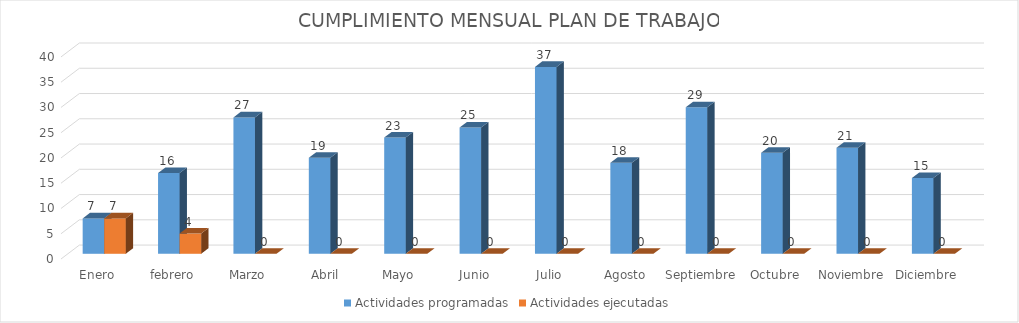
| Category | Actividades programadas | Actividades ejecutadas |
|---|---|---|
| Enero | 7 | 7 |
| febrero | 16 | 4 |
| Marzo | 27 | 0 |
|  Abril | 19 | 0 |
| Mayo | 23 | 0 |
| Junio | 25 | 0 |
| Julio | 37 | 0 |
| Agosto | 18 | 0 |
| Septiembre | 29 | 0 |
| Octubre | 20 | 0 |
| Noviembre | 21 | 0 |
| Diciembre | 15 | 0 |